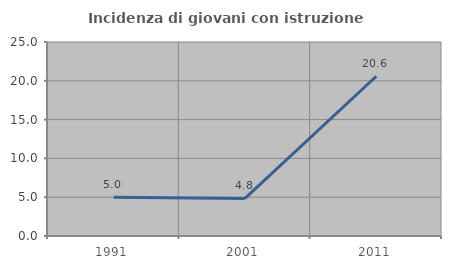
| Category | Incidenza di giovani con istruzione universitaria |
|---|---|
| 1991.0 | 5 |
| 2001.0 | 4.839 |
| 2011.0 | 20.588 |